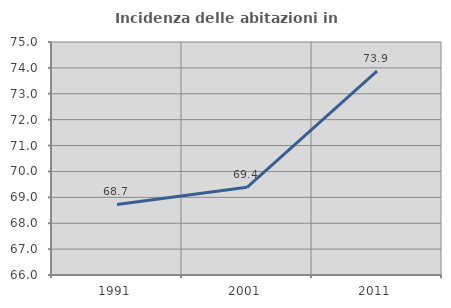
| Category | Incidenza delle abitazioni in proprietà  |
|---|---|
| 1991.0 | 68.726 |
| 2001.0 | 69.385 |
| 2011.0 | 73.872 |